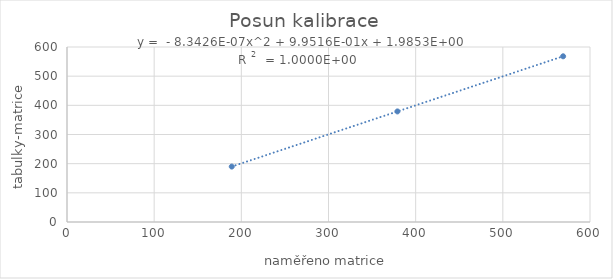
| Category | posun kalibrace |
|---|---|
| 189.009 | 190.05 |
| 379.068 | 379.099 |
| 569.17 | 568.131 |